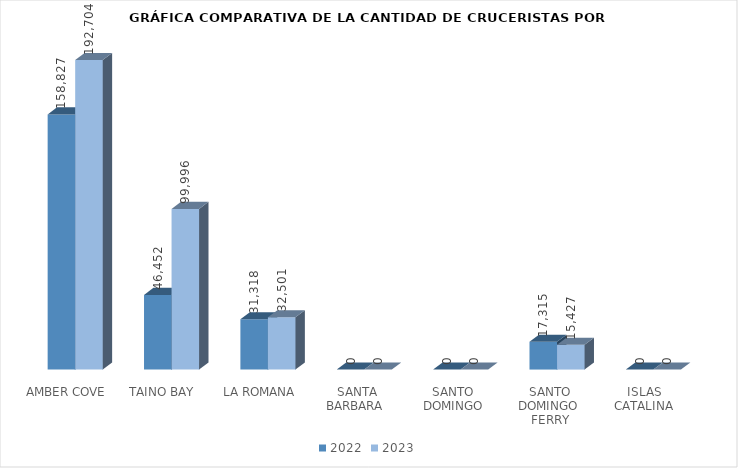
| Category | 2022 | 2023 |
|---|---|---|
| AMBER COVE | 158827 | 192704 |
| TAINO BAY | 46452 | 99996 |
| LA ROMANA | 31318 | 32501 |
| SANTA BARBARA  | 0 | 0 |
| SANTO DOMINGO | 0 | 0 |
| SANTO DOMINGO  FERRY | 17315 | 15427 |
| ISLAS  CATALINA  | 0 | 0 |